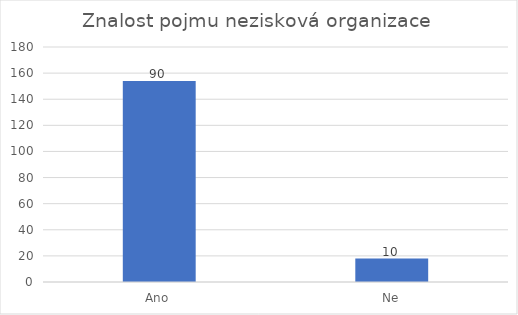
| Category | Počet respondentů |
|---|---|
| Ano | 154 |
| Ne | 18 |